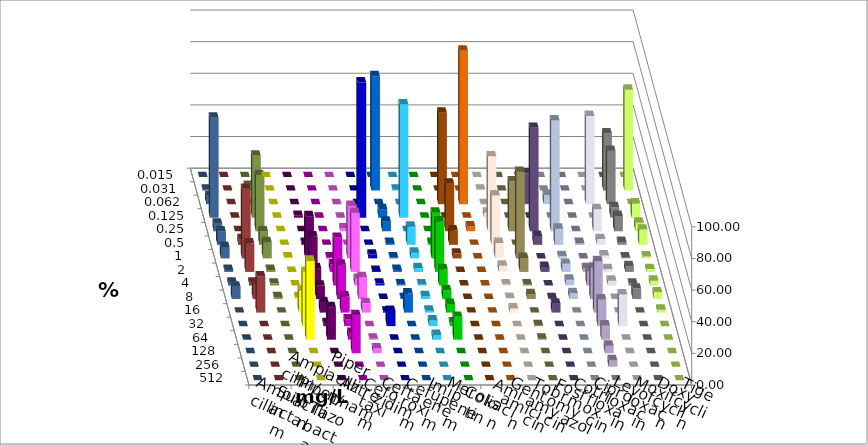
| Category | Ampicillin | Ampicillin/ Sulbactam | Piperacillin | Piperacillin/ Tazobactam | Aztreonam | Cefotaxim | Ceftazidim | Cefuroxim | Imipenem | Meropenem | Colistin | Amikacin | Gentamicin | Tobramycin | Fosfomycin | Cotrimoxazol | Ciprofloxacin | Levofloxacin | Moxifloxacin | Doxycyclin | Tigecyclin |
|---|---|---|---|---|---|---|---|---|---|---|---|---|---|---|---|---|---|---|---|---|---|
| 0.015 | 0 | 0 | 0 | 0 | 0 | 0 | 0 | 0 | 0 | 0 | 0 | 0 | 0 | 0 | 0 | 0 | 0 | 0 | 0 | 0 | 0 |
| 0.031 | 0 | 0 | 0 | 0 | 0 | 72.289 | 0.602 | 0 | 0 | 0 | 0.649 | 0 | 0 | 0 | 0 | 0 | 36.145 | 63.855 | 0.602 | 0 | 3.012 |
| 0.062 | 0 | 0 | 0 | 0 | 0 | 0 | 0 | 0 | 57.831 | 96.988 | 0 | 0 | 19.497 | 5.839 | 0 | 55.758 | 33.735 | 0 | 4.819 | 0 | 0 |
| 0.125 | 0 | 1.212 | 0 | 0 | 85.542 | 5.422 | 71.687 | 0 | 0 | 0 | 3.247 | 0 | 0 | 0 | 0 | 0 | 6.627 | 9.036 | 63.253 | 0 | 39.157 |
| 0.25 | 0 | 0 | 0 | 1.807 | 0 | 6.024 | 0 | 0 | 30.12 | 3.012 | 47.403 | 31.447 | 65.409 | 70.073 | 0 | 13.939 | 9.639 | 5.422 | 4.819 | 0 | 35.542 |
| 0.5 | 0 | 1.212 | 0 | 0 | 0 | 1.205 | 11.446 | 1.205 | 9.036 | 0 | 31.169 | 0 | 5.66 | 10.219 | 1.205 | 3.636 | 1.807 | 9.639 | 8.434 | 3.614 | 8.434 |
| 1.0 | 0.602 | 26.667 | 0.602 | 33.133 | 2.41 | 0.602 | 3.614 | 28.916 | 3.012 | 0 | 9.74 | 54.717 | 0 | 1.46 | 0 | 1.818 | 0.602 | 1.205 | 7.229 | 43.976 | 10.241 |
| 2.0 | 0 | 22.424 | 4.819 | 37.349 | 0.602 | 1.205 | 2.41 | 31.928 | 0 | 0 | 3.896 | 8.805 | 3.145 | 5.109 | 2.41 | 1.818 | 3.614 | 1.807 | 1.205 | 18.072 | 1.205 |
| 4.0 | 0 | 10.909 | 30.12 | 4.217 | 1.205 | 0.602 | 0.602 | 10.241 | 0 | 0 | 0.649 | 0.629 | 0 | 3.65 | 9.036 | 3.03 | 1.205 | 3.012 | 1.807 | 1.807 | 1.205 |
| 8.0 | 1.205 | 8.485 | 21.687 | 13.855 | 0 | 0.602 | 1.807 | 5.422 | 0 | 0 | 0.649 | 3.145 | 0.629 | 3.65 | 19.88 | 0 | 6.627 | 4.217 | 7.831 | 9.639 | 1.205 |
| 16.0 | 13.855 | 6.667 | 10.241 | 6.024 | 0.602 | 12.048 | 1.205 | 5.422 | 0 | 0 | 2.597 | 0 | 5.66 | 0 | 32.53 | 0 | 0 | 1.807 | 0 | 22.892 | 0 |
| 32.0 | 34.337 | 1.818 | 4.217 | 0 | 9.639 | 0 | 3.614 | 2.41 | 0 | 0 | 0 | 0.629 | 0 | 0 | 16.867 | 20 | 0 | 0 | 0 | 0 | 0 |
| 64.0 | 50 | 20.606 | 4.217 | 0.602 | 0 | 0 | 3.012 | 14.458 | 0 | 0 | 0 | 0.629 | 0 | 0 | 9.036 | 0 | 0 | 0 | 0 | 0 | 0 |
| 128.0 | 0 | 0 | 24.096 | 3.012 | 0 | 0 | 0 | 0 | 0 | 0 | 0 | 0 | 0 | 0 | 4.819 | 0 | 0 | 0 | 0 | 0 | 0 |
| 256.0 | 0 | 0 | 0 | 0 | 0 | 0 | 0 | 0 | 0 | 0 | 0 | 0 | 0 | 0 | 4.217 | 0 | 0 | 0 | 0 | 0 | 0 |
| 512.0 | 0 | 0 | 0 | 0 | 0 | 0 | 0 | 0 | 0 | 0 | 0 | 0 | 0 | 0 | 0 | 0 | 0 | 0 | 0 | 0 | 0 |